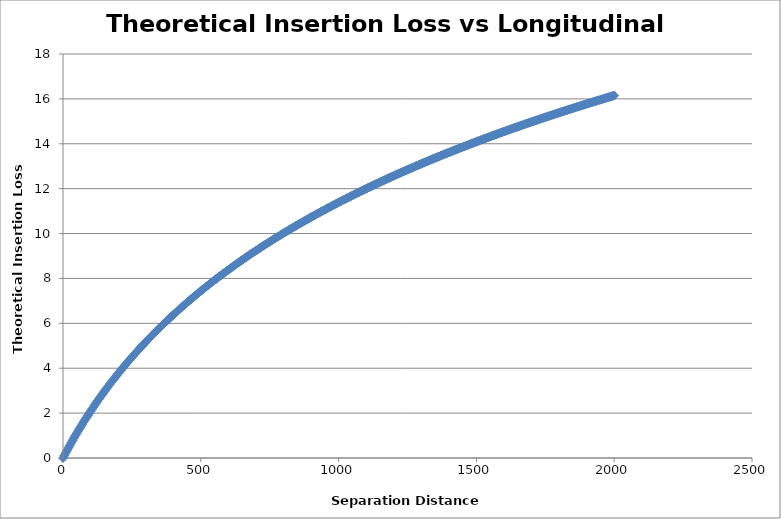
| Category | Theoretical Insertion Loss for 200um fiber |
|---|---|
| 0.0 | 0 |
| 5.0 | 0.117 |
| 10.0 | 0.232 |
| 15.0 | 0.346 |
| 20.0 | 0.458 |
| 25.0 | 0.569 |
| 30.0 | 0.679 |
| 35.0 | 0.787 |
| 40.0 | 0.894 |
| 45.0 | 0.999 |
| 50.0 | 1.104 |
| 55.0 | 1.207 |
| 60.0 | 1.308 |
| 65.0 | 1.409 |
| 70.0 | 1.509 |
| 75.0 | 1.607 |
| 80.0 | 1.704 |
| 85.0 | 1.8 |
| 90.0 | 1.895 |
| 95.0 | 1.99 |
| 100.0 | 2.083 |
| 105.0 | 2.175 |
| 110.0 | 2.266 |
| 115.0 | 2.356 |
| 120.0 | 2.445 |
| 125.0 | 2.534 |
| 130.0 | 2.621 |
| 135.0 | 2.708 |
| 140.0 | 2.793 |
| 145.0 | 2.878 |
| 150.0 | 2.962 |
| 155.0 | 3.046 |
| 160.0 | 3.128 |
| 165.0 | 3.21 |
| 170.0 | 3.291 |
| 175.0 | 3.371 |
| 180.0 | 3.45 |
| 185.0 | 3.529 |
| 190.0 | 3.607 |
| 195.0 | 3.685 |
| 200.0 | 3.761 |
| 205.0 | 3.837 |
| 210.0 | 3.913 |
| 215.0 | 3.987 |
| 220.0 | 4.061 |
| 225.0 | 4.135 |
| 230.0 | 4.207 |
| 235.0 | 4.28 |
| 240.0 | 4.351 |
| 245.0 | 4.422 |
| 250.0 | 4.493 |
| 255.0 | 4.563 |
| 260.0 | 4.632 |
| 265.0 | 4.701 |
| 270.0 | 4.769 |
| 275.0 | 4.837 |
| 280.0 | 4.904 |
| 285.0 | 4.97 |
| 290.0 | 5.037 |
| 295.0 | 5.102 |
| 300.0 | 5.167 |
| 305.0 | 5.232 |
| 310.0 | 5.296 |
| 315.0 | 5.36 |
| 320.0 | 5.423 |
| 325.0 | 5.486 |
| 330.0 | 5.548 |
| 335.0 | 5.61 |
| 340.0 | 5.672 |
| 345.0 | 5.733 |
| 350.0 | 5.793 |
| 355.0 | 5.854 |
| 360.0 | 5.913 |
| 365.0 | 5.973 |
| 370.0 | 6.032 |
| 375.0 | 6.09 |
| 380.0 | 6.148 |
| 385.0 | 6.206 |
| 390.0 | 6.264 |
| 395.0 | 6.321 |
| 400.0 | 6.377 |
| 405.0 | 6.434 |
| 410.0 | 6.489 |
| 415.0 | 6.545 |
| 420.0 | 6.6 |
| 425.0 | 6.655 |
| 430.0 | 6.71 |
| 435.0 | 6.764 |
| 440.0 | 6.818 |
| 445.0 | 6.871 |
| 450.0 | 6.924 |
| 455.0 | 6.977 |
| 460.0 | 7.03 |
| 465.0 | 7.082 |
| 470.0 | 7.134 |
| 475.0 | 7.186 |
| 480.0 | 7.237 |
| 485.0 | 7.288 |
| 490.0 | 7.339 |
| 495.0 | 7.389 |
| 500.0 | 7.439 |
| 505.0 | 7.489 |
| 510.0 | 7.538 |
| 515.0 | 7.588 |
| 520.0 | 7.637 |
| 525.0 | 7.685 |
| 530.0 | 7.734 |
| 535.0 | 7.782 |
| 540.0 | 7.83 |
| 545.0 | 7.878 |
| 550.0 | 7.925 |
| 555.0 | 7.972 |
| 560.0 | 8.019 |
| 565.0 | 8.066 |
| 570.0 | 8.112 |
| 575.0 | 8.158 |
| 580.0 | 8.204 |
| 585.0 | 8.25 |
| 590.0 | 8.295 |
| 595.0 | 8.34 |
| 600.0 | 8.385 |
| 605.0 | 8.43 |
| 610.0 | 8.474 |
| 615.0 | 8.518 |
| 620.0 | 8.563 |
| 625.0 | 8.606 |
| 630.0 | 8.65 |
| 635.0 | 8.693 |
| 640.0 | 8.736 |
| 645.0 | 8.779 |
| 650.0 | 8.822 |
| 655.0 | 8.865 |
| 660.0 | 8.907 |
| 665.0 | 8.949 |
| 670.0 | 8.991 |
| 675.0 | 9.033 |
| 680.0 | 9.074 |
| 685.0 | 9.115 |
| 690.0 | 9.156 |
| 695.0 | 9.197 |
| 700.0 | 9.238 |
| 705.0 | 9.279 |
| 710.0 | 9.319 |
| 715.0 | 9.359 |
| 720.0 | 9.399 |
| 725.0 | 9.439 |
| 730.0 | 9.478 |
| 735.0 | 9.518 |
| 740.0 | 9.557 |
| 745.0 | 9.596 |
| 750.0 | 9.635 |
| 755.0 | 9.674 |
| 760.0 | 9.712 |
| 765.0 | 9.751 |
| 770.0 | 9.789 |
| 775.0 | 9.827 |
| 780.0 | 9.865 |
| 785.0 | 9.903 |
| 790.0 | 9.94 |
| 795.0 | 9.978 |
| 800.0 | 10.015 |
| 805.0 | 10.052 |
| 810.0 | 10.089 |
| 815.0 | 10.126 |
| 820.0 | 10.162 |
| 825.0 | 10.199 |
| 830.0 | 10.235 |
| 835.0 | 10.271 |
| 840.0 | 10.307 |
| 845.0 | 10.343 |
| 850.0 | 10.379 |
| 855.0 | 10.414 |
| 860.0 | 10.45 |
| 865.0 | 10.485 |
| 870.0 | 10.52 |
| 875.0 | 10.555 |
| 880.0 | 10.59 |
| 885.0 | 10.624 |
| 890.0 | 10.659 |
| 895.0 | 10.693 |
| 900.0 | 10.728 |
| 905.0 | 10.762 |
| 910.0 | 10.796 |
| 915.0 | 10.83 |
| 920.0 | 10.864 |
| 925.0 | 10.897 |
| 930.0 | 10.931 |
| 935.0 | 10.964 |
| 940.0 | 10.997 |
| 945.0 | 11.03 |
| 950.0 | 11.063 |
| 955.0 | 11.096 |
| 960.0 | 11.129 |
| 965.0 | 11.162 |
| 970.0 | 11.194 |
| 975.0 | 11.226 |
| 980.0 | 11.259 |
| 985.0 | 11.291 |
| 990.0 | 11.323 |
| 995.0 | 11.355 |
| 1000.0 | 11.387 |
| 1005.0 | 11.418 |
| 1010.0 | 11.45 |
| 1015.0 | 11.481 |
| 1020.0 | 11.512 |
| 1025.0 | 11.544 |
| 1030.0 | 11.575 |
| 1035.0 | 11.606 |
| 1040.0 | 11.637 |
| 1045.0 | 11.667 |
| 1050.0 | 11.698 |
| 1055.0 | 11.729 |
| 1060.0 | 11.759 |
| 1065.0 | 11.789 |
| 1070.0 | 11.82 |
| 1075.0 | 11.85 |
| 1080.0 | 11.88 |
| 1085.0 | 11.91 |
| 1090.0 | 11.94 |
| 1095.0 | 11.969 |
| 1100.0 | 11.999 |
| 1105.0 | 12.028 |
| 1110.0 | 12.058 |
| 1115.0 | 12.087 |
| 1120.0 | 12.116 |
| 1125.0 | 12.145 |
| 1130.0 | 12.174 |
| 1135.0 | 12.203 |
| 1140.0 | 12.232 |
| 1145.0 | 12.261 |
| 1150.0 | 12.29 |
| 1155.0 | 12.318 |
| 1160.0 | 12.347 |
| 1165.0 | 12.375 |
| 1170.0 | 12.403 |
| 1175.0 | 12.431 |
| 1180.0 | 12.459 |
| 1185.0 | 12.487 |
| 1190.0 | 12.515 |
| 1195.0 | 12.543 |
| 1200.0 | 12.571 |
| 1205.0 | 12.598 |
| 1210.0 | 12.626 |
| 1215.0 | 12.653 |
| 1220.0 | 12.681 |
| 1225.0 | 12.708 |
| 1230.0 | 12.735 |
| 1235.0 | 12.762 |
| 1240.0 | 12.789 |
| 1245.0 | 12.816 |
| 1250.0 | 12.843 |
| 1255.0 | 12.87 |
| 1260.0 | 12.897 |
| 1265.0 | 12.923 |
| 1270.0 | 12.95 |
| 1275.0 | 12.976 |
| 1280.0 | 13.003 |
| 1285.0 | 13.029 |
| 1290.0 | 13.055 |
| 1295.0 | 13.081 |
| 1300.0 | 13.107 |
| 1305.0 | 13.133 |
| 1310.0 | 13.159 |
| 1315.0 | 13.185 |
| 1320.0 | 13.211 |
| 1325.0 | 13.237 |
| 1330.0 | 13.262 |
| 1335.0 | 13.288 |
| 1340.0 | 13.313 |
| 1345.0 | 13.339 |
| 1350.0 | 13.364 |
| 1355.0 | 13.389 |
| 1360.0 | 13.414 |
| 1365.0 | 13.439 |
| 1370.0 | 13.464 |
| 1375.0 | 13.489 |
| 1380.0 | 13.514 |
| 1385.0 | 13.539 |
| 1390.0 | 13.564 |
| 1395.0 | 13.588 |
| 1400.0 | 13.613 |
| 1405.0 | 13.637 |
| 1410.0 | 13.662 |
| 1415.0 | 13.686 |
| 1420.0 | 13.711 |
| 1425.0 | 13.735 |
| 1430.0 | 13.759 |
| 1435.0 | 13.783 |
| 1440.0 | 13.807 |
| 1445.0 | 13.831 |
| 1450.0 | 13.855 |
| 1455.0 | 13.879 |
| 1460.0 | 13.903 |
| 1465.0 | 13.926 |
| 1470.0 | 13.95 |
| 1475.0 | 13.974 |
| 1480.0 | 13.997 |
| 1485.0 | 14.021 |
| 1490.0 | 14.044 |
| 1495.0 | 14.067 |
| 1500.0 | 14.091 |
| 1505.0 | 14.114 |
| 1510.0 | 14.137 |
| 1515.0 | 14.16 |
| 1520.0 | 14.183 |
| 1525.0 | 14.206 |
| 1530.0 | 14.229 |
| 1535.0 | 14.252 |
| 1540.0 | 14.274 |
| 1545.0 | 14.297 |
| 1550.0 | 14.32 |
| 1555.0 | 14.342 |
| 1560.0 | 14.365 |
| 1565.0 | 14.387 |
| 1570.0 | 14.41 |
| 1575.0 | 14.432 |
| 1580.0 | 14.455 |
| 1585.0 | 14.477 |
| 1590.0 | 14.499 |
| 1595.0 | 14.521 |
| 1600.0 | 14.543 |
| 1605.0 | 14.565 |
| 1610.0 | 14.587 |
| 1615.0 | 14.609 |
| 1620.0 | 14.631 |
| 1625.0 | 14.653 |
| 1630.0 | 14.675 |
| 1635.0 | 14.696 |
| 1640.0 | 14.718 |
| 1645.0 | 14.74 |
| 1650.0 | 14.761 |
| 1655.0 | 14.783 |
| 1660.0 | 14.804 |
| 1665.0 | 14.825 |
| 1670.0 | 14.847 |
| 1675.0 | 14.868 |
| 1680.0 | 14.889 |
| 1685.0 | 14.91 |
| 1690.0 | 14.931 |
| 1695.0 | 14.952 |
| 1700.0 | 14.974 |
| 1705.0 | 14.994 |
| 1710.0 | 15.015 |
| 1715.0 | 15.036 |
| 1720.0 | 15.057 |
| 1725.0 | 15.078 |
| 1730.0 | 15.099 |
| 1735.0 | 15.119 |
| 1740.0 | 15.14 |
| 1745.0 | 15.16 |
| 1750.0 | 15.181 |
| 1755.0 | 15.201 |
| 1760.0 | 15.222 |
| 1765.0 | 15.242 |
| 1770.0 | 15.263 |
| 1775.0 | 15.283 |
| 1780.0 | 15.303 |
| 1785.0 | 15.323 |
| 1790.0 | 15.343 |
| 1795.0 | 15.363 |
| 1800.0 | 15.383 |
| 1805.0 | 15.403 |
| 1810.0 | 15.423 |
| 1815.0 | 15.443 |
| 1820.0 | 15.463 |
| 1825.0 | 15.483 |
| 1830.0 | 15.503 |
| 1835.0 | 15.523 |
| 1840.0 | 15.542 |
| 1845.0 | 15.562 |
| 1850.0 | 15.581 |
| 1855.0 | 15.601 |
| 1860.0 | 15.62 |
| 1865.0 | 15.64 |
| 1870.0 | 15.659 |
| 1875.0 | 15.679 |
| 1880.0 | 15.698 |
| 1885.0 | 15.717 |
| 1890.0 | 15.737 |
| 1895.0 | 15.756 |
| 1900.0 | 15.775 |
| 1905.0 | 15.794 |
| 1910.0 | 15.813 |
| 1915.0 | 15.832 |
| 1920.0 | 15.851 |
| 1925.0 | 15.87 |
| 1930.0 | 15.889 |
| 1935.0 | 15.908 |
| 1940.0 | 15.927 |
| 1945.0 | 15.946 |
| 1950.0 | 15.964 |
| 1955.0 | 15.983 |
| 1960.0 | 16.002 |
| 1965.0 | 16.02 |
| 1970.0 | 16.039 |
| 1975.0 | 16.057 |
| 1980.0 | 16.076 |
| 1985.0 | 16.094 |
| 1990.0 | 16.113 |
| 1995.0 | 16.131 |
| 2000.0 | 16.15 |